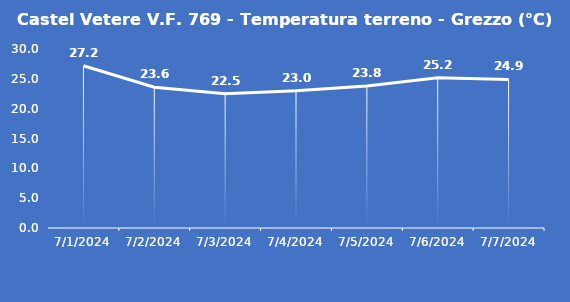
| Category | Castel Vetere V.F. 769 - Temperatura terreno - Grezzo (°C) |
|---|---|
| 7/1/24 | 27.2 |
| 7/2/24 | 23.6 |
| 7/3/24 | 22.5 |
| 7/4/24 | 23 |
| 7/5/24 | 23.8 |
| 7/6/24 | 25.2 |
| 7/7/24 | 24.9 |